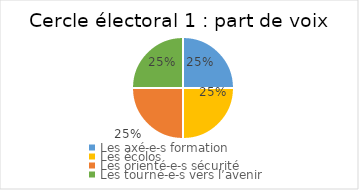
| Category | Part de voix |
|---|---|
| Les axé-e-s formation | 0.25 |
| Les écolos | 0.25 |
| Les orienté-e-s sécurité | 0.25 |
| Les tourné-e-s vers l’avenir | 0.25 |